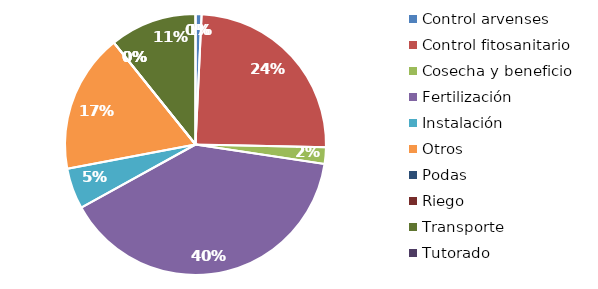
| Category | Valor |
|---|---|
| Control arvenses | 261217 |
| Control fitosanitario | 8585442 |
| Cosecha y beneficio | 718183.2 |
| Fertilización | 13825689 |
| Instalación | 1762173.499 |
| Otros | 6017035 |
| Podas | 0 |
| Riego | 0 |
| Transporte | 3758796 |
| Tutorado | 0 |